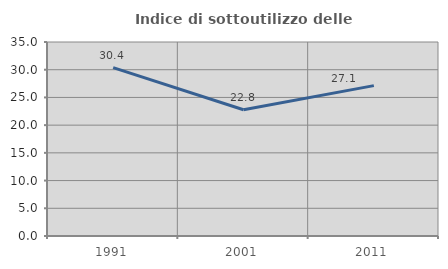
| Category | Indice di sottoutilizzo delle abitazioni  |
|---|---|
| 1991.0 | 30.374 |
| 2001.0 | 22.78 |
| 2011.0 | 27.132 |